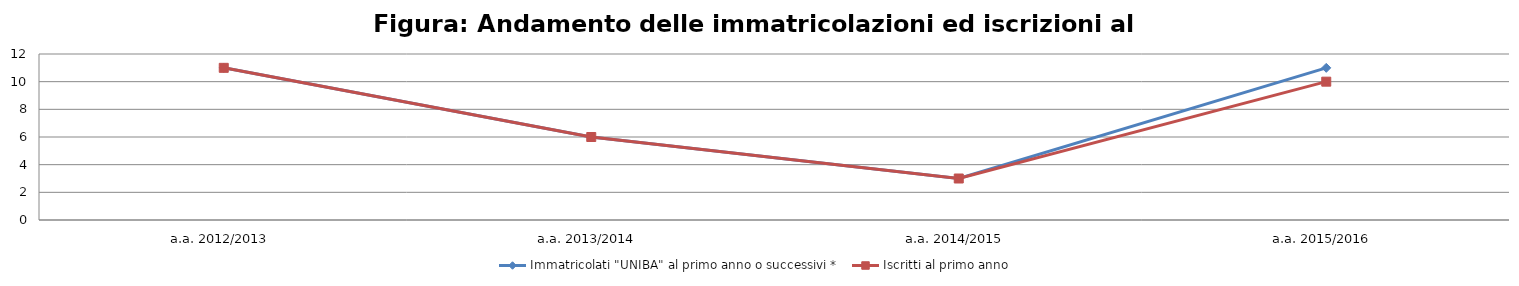
| Category | Immatricolati "UNIBA" al primo anno o successivi * | Iscritti al primo anno  |
|---|---|---|
| a.a. 2012/2013 | 11 | 11 |
| a.a. 2013/2014 | 6 | 6 |
| a.a. 2014/2015 | 3 | 3 |
| a.a. 2015/2016 | 11 | 10 |